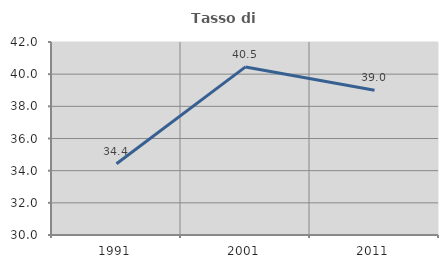
| Category | Tasso di occupazione   |
|---|---|
| 1991.0 | 34.428 |
| 2001.0 | 40.451 |
| 2011.0 | 39.002 |